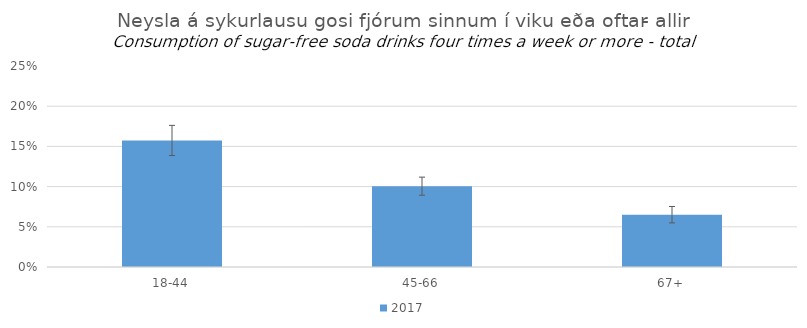
| Category | 2017 |
|---|---|
| 18-44 | 0.157 |
| 45-66 | 0.101 |
| 67+ | 0.065 |